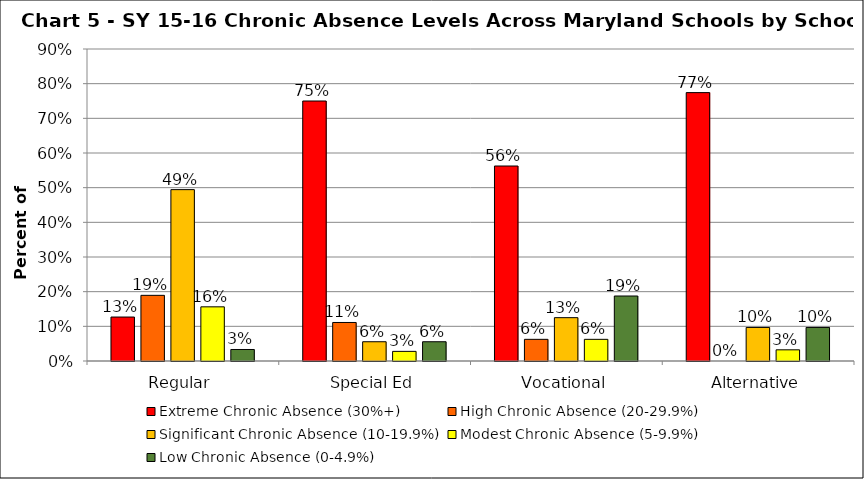
| Category | Extreme Chronic Absence (30%+) | High Chronic Absence (20-29.9%) | Significant Chronic Absence (10-19.9%) | Modest Chronic Absence (5-9.9%) | Low Chronic Absence (0-4.9%) |
|---|---|---|---|---|---|
| 0 | 0.127 | 0.189 | 0.494 | 0.156 | 0.033 |
| 1 | 0.75 | 0.111 | 0.056 | 0.028 | 0.056 |
| 2 | 0.562 | 0.062 | 0.125 | 0.062 | 0.188 |
| 3 | 0.774 | 0 | 0.097 | 0.032 | 0.097 |